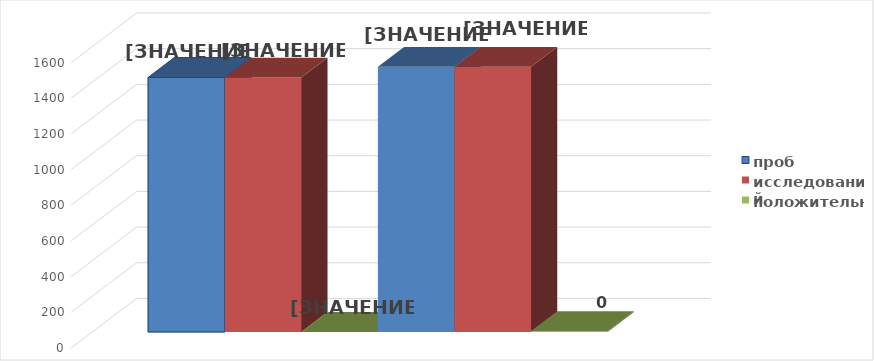
| Category | проб | исследований | положительных | Series 3 | Series 5 | Series 6 |
|---|---|---|---|---|---|---|
| 0 | 1426 | 1426 | 0 | 1486 | 1486 | 5 |